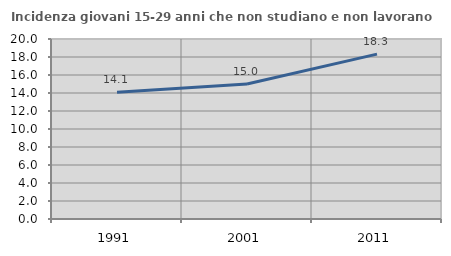
| Category | Incidenza giovani 15-29 anni che non studiano e non lavorano  |
|---|---|
| 1991.0 | 14.086 |
| 2001.0 | 15.002 |
| 2011.0 | 18.318 |